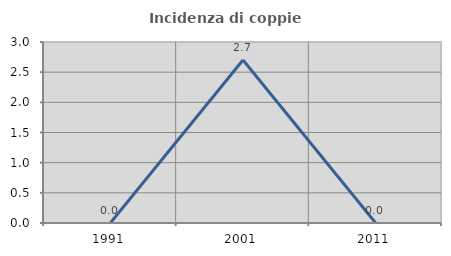
| Category | Incidenza di coppie miste |
|---|---|
| 1991.0 | 0 |
| 2001.0 | 2.703 |
| 2011.0 | 0 |